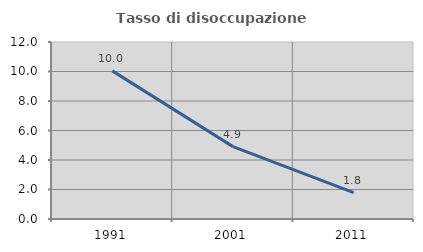
| Category | Tasso di disoccupazione giovanile  |
|---|---|
| 1991.0 | 10.044 |
| 2001.0 | 4.908 |
| 2011.0 | 1.786 |